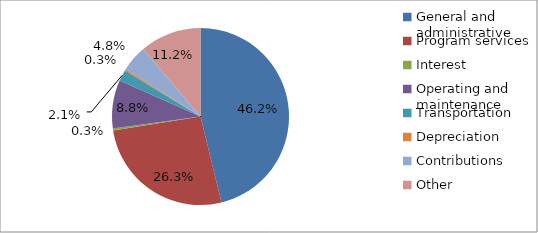
| Category | Series 0 |
|---|---|
| General and administrative | 2872198 |
| Program services | 1635214 |
| Interest | 21094 |
| Operating and maintenance | 549099 |
| Transportation | 126887 |
| Depreciation | 19257 |
| Contributions | 297807 |
| Other | 696978 |